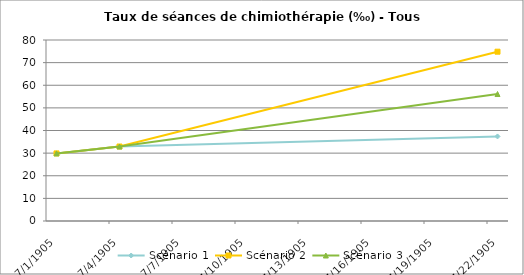
| Category | Scénario 1 | Scénario 2 | Scénario 3 |
|---|---|---|---|
| 2009.0 | 29.875 | 29.875 | 29.875 |
| 2012.0 | 32.926 | 32.926 | 32.926 |
| 2030.0 | 37.369 | 74.833 | 56.125 |